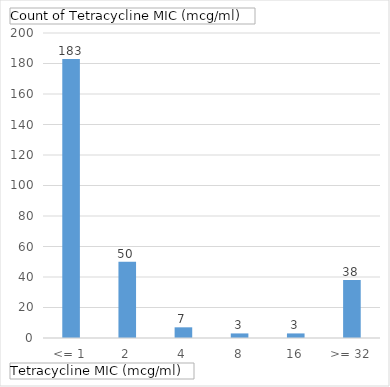
| Category | Total |
|---|---|
| <= 1 | 183 |
| 2 | 50 |
| 4 | 7 |
| 8 | 3 |
| 16 | 3 |
| >= 32 | 38 |